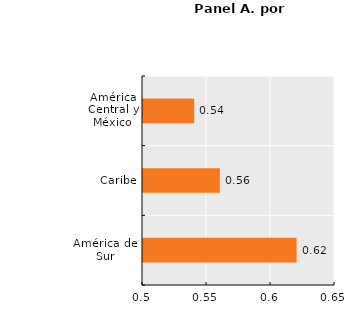
| Category | Series 0 |
|---|---|
| América del Sur | 0.62 |
| Caribe | 0.56 |
| América Central y México | 0.54 |